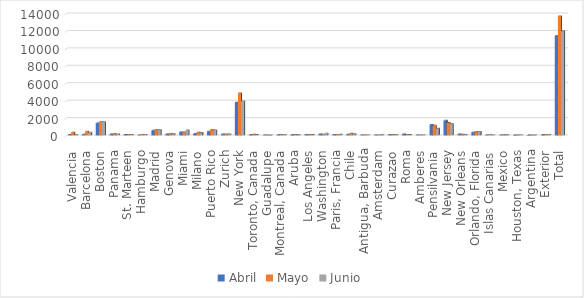
| Category | Abril | Mayo | Junio |
|---|---|---|---|
| Valencia | 67 | 335 | 80 |
| Barcelona | 101 | 440 | 319 |
| Boston | 1395 | 1524 | 1527 |
| Panama | 117 | 160 | 127 |
| St. Marteen | 80 | 79 | 80 |
| Hamburgo | 10 | 45 | 63 |
| Madrid | 554 | 628 | 626 |
| Genova | 114 | 179 | 142 |
| Miami | 370 | 368 | 582 |
| Milano | 177 | 331 | 289 |
| Puerto Rico | 450 | 654 | 588 |
| Zurich | 122 | 119 | 122 |
| New York | 3759 | 4845 | 3906 |
| Toronto, Canada | 45 | 85 | 59 |
| Guadalupe | 9 | 0 | 0 |
| Montreal, Canada | 44 | 46 | 41 |
| Aruba | 31 | 65 | 29 |
| Los Angeles | 53 | 53 | 55 |
| Washington | 125 | 104 | 207 |
| Paris, Francia | 47 | 47 | 85 |
| Chile | 99 | 221 | 145 |
| Antigua, Barbuda | 9 | 16 | 12 |
| Amsterdam | 16 | 21 | 29 |
| Curazao | 49 | 65 | 64 |
| Roma | 123 | 64 | 60 |
| Amberes | 8 | 15 | 9 |
| Pensilvania | 1220 | 1123 | 773 |
| New Jersey | 1696 | 1433 | 1325 |
| New Orleans | 118 | 86 | 70 |
| Orlando, Florida | 336 | 422 | 427 |
| Islas Canarias | 20 | 32 | 19 |
| Mexico | 16 | 29 | 29 |
| Houston, Texas | 0 | 0 | 13 |
| Argentina | 0 | 0 | 0 |
| Exterior | 26 | 47 | 63 |
| Total | 11406 | 13681 | 11965 |